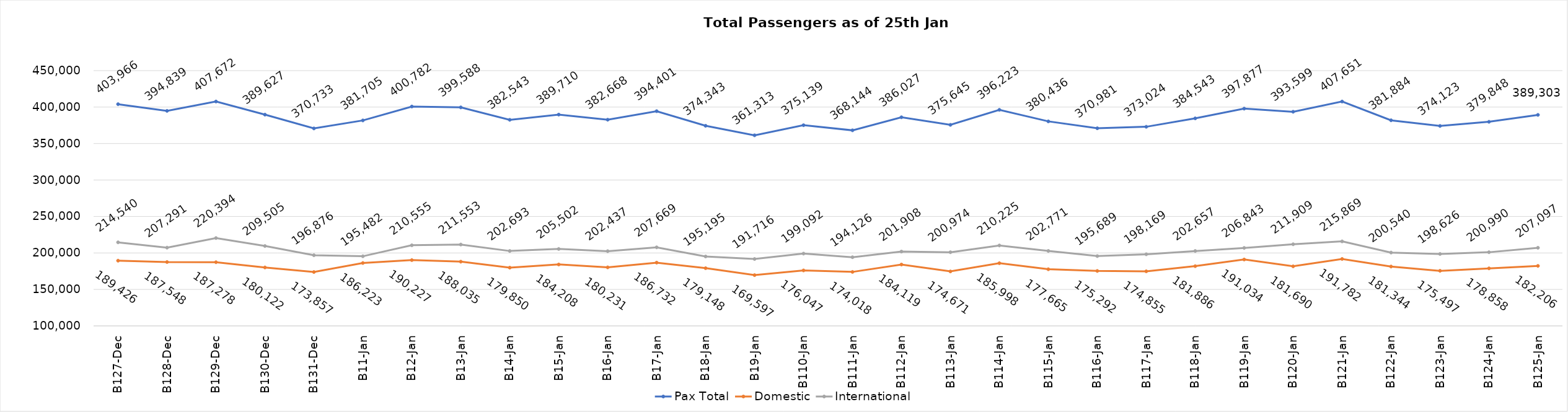
| Category | Pax Total | Domestic | International |
|---|---|---|---|
| 2023-12-27 | 403966 | 189426 | 214540 |
| 2023-12-28 | 394839 | 187548 | 207291 |
| 2023-12-29 | 407672 | 187278 | 220394 |
| 2023-12-30 | 389627 | 180122 | 209505 |
| 2023-12-31 | 370733 | 173857 | 196876 |
| 2024-01-01 | 381705 | 186223 | 195482 |
| 2024-01-02 | 400782 | 190227 | 210555 |
| 2024-01-03 | 399588 | 188035 | 211553 |
| 2024-01-04 | 382543 | 179850 | 202693 |
| 2024-01-05 | 389710 | 184208 | 205502 |
| 2024-01-06 | 382668 | 180231 | 202437 |
| 2024-01-07 | 394401 | 186732 | 207669 |
| 2024-01-08 | 374343 | 179148 | 195195 |
| 2024-01-09 | 361313 | 169597 | 191716 |
| 2024-01-10 | 375139 | 176047 | 199092 |
| 2024-01-11 | 368144 | 174018 | 194126 |
| 2024-01-12 | 386027 | 184119 | 201908 |
| 2024-01-13 | 375645 | 174671 | 200974 |
| 2024-01-14 | 396223 | 185998 | 210225 |
| 2024-01-15 | 380436 | 177665 | 202771 |
| 2024-01-16 | 370981 | 175292 | 195689 |
| 2024-01-17 | 373024 | 174855 | 198169 |
| 2024-01-18 | 384543 | 181886 | 202657 |
| 2024-01-19 | 397877 | 191034 | 206843 |
| 2024-01-20 | 393599 | 181690 | 211909 |
| 2024-01-21 | 407651 | 191782 | 215869 |
| 2024-01-22 | 381884 | 181344 | 200540 |
| 2024-01-23 | 374123 | 175497 | 198626 |
| 2024-01-24 | 379848 | 178858 | 200990 |
| 2024-01-25 | 389303 | 182206 | 207097 |